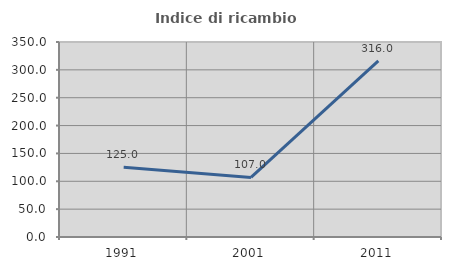
| Category | Indice di ricambio occupazionale  |
|---|---|
| 1991.0 | 125 |
| 2001.0 | 106.977 |
| 2011.0 | 316 |